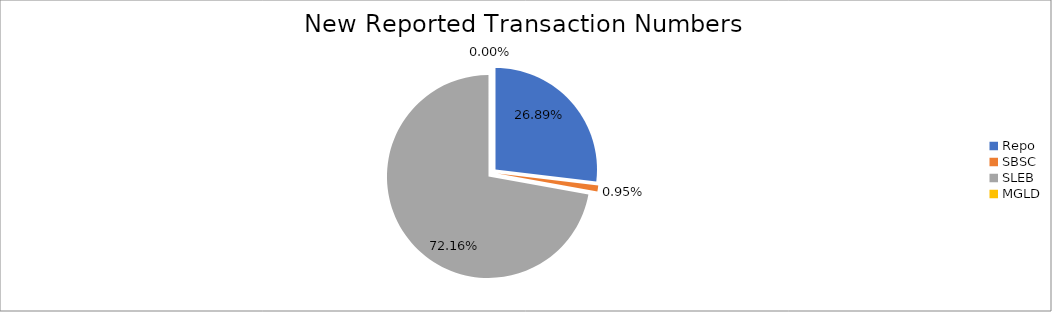
| Category | Series 0 |
|---|---|
| Repo | 258047 |
| SBSC | 9072 |
| SLEB | 692384 |
| MGLD | 24 |